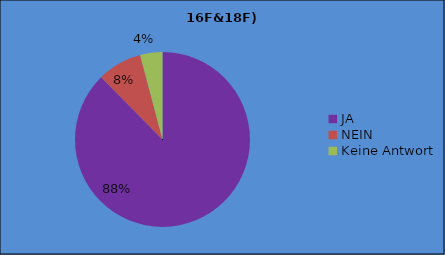
| Category | 16F | 18F |
|---|---|---|
| JA | 85 | 92 |
| NEIN | 8 | 0 |
| Keine Antwort | 4 | 4 |